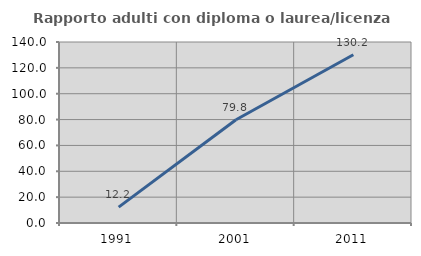
| Category | Rapporto adulti con diploma o laurea/licenza media  |
|---|---|
| 1991.0 | 12.245 |
| 2001.0 | 79.839 |
| 2011.0 | 130.159 |